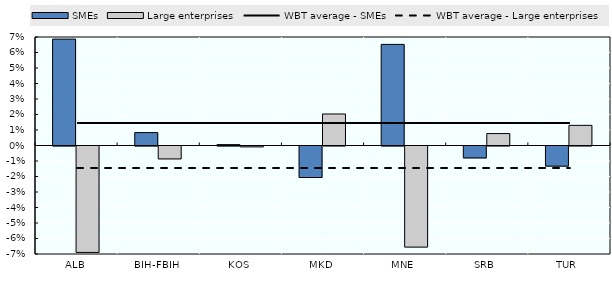
| Category | SMEs | Large enterprises |
|---|---|---|
| ALB | 0.069 | -0.069 |
| BIH-FBIH | 0.008 | -0.008 |
| KOS | 0.001 | -0.001 |
| MKD | -0.02 | 0.02 |
| MNE | 0.065 | -0.065 |
| SRB | -0.008 | 0.008 |
| TUR | -0.013 | 0.013 |